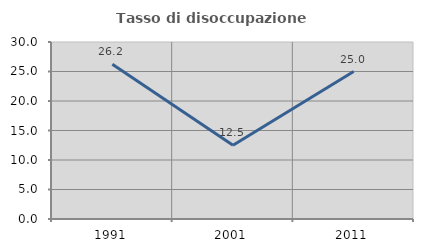
| Category | Tasso di disoccupazione giovanile  |
|---|---|
| 1991.0 | 26.214 |
| 2001.0 | 12.5 |
| 2011.0 | 25 |